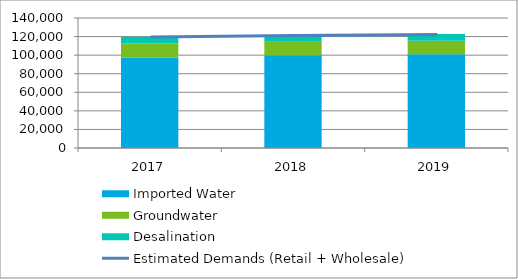
| Category | Imported Water | Groundwater | Desalination |
|---|---|---|---|
| 0 | 97217 | 15269.109 | 7287.895 |
| 1 | 99805 | 14709.783 | 7287.895 |
| 2 | 101053 | 14556.575 | 7287.895 |